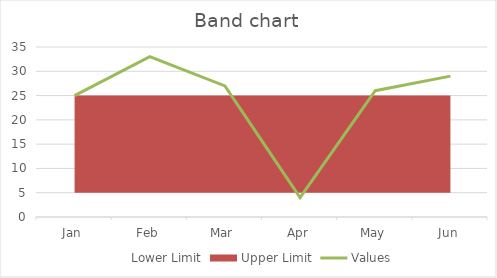
| Category | Values |
|---|---|
| Jan | 25 |
| Feb | 33 |
| Mar | 27 |
| Apr | 4 |
| May | 26 |
| Jun | 29 |